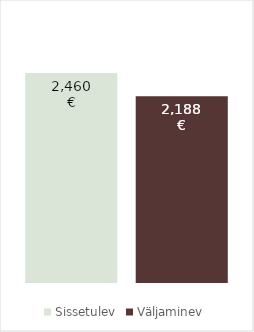
| Category | Sissetulev | Väljaminev |
|---|---|---|
| 0 | 2460 | 2188.333 |